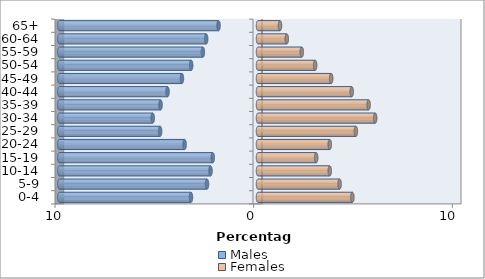
| Category | Males | Females |
|---|---|---|
| 0-4 | -3.374 | 4.751 |
| 5-9 | -2.567 | 4.109 |
| 10-14 | -2.391 | 3.612 |
| 15-19 | -2.277 | 2.929 |
| 20-24 | -3.695 | 3.612 |
| 25-29 | -4.927 | 4.927 |
| 30-34 | -5.299 | 5.899 |
| 35-39 | -4.906 | 5.568 |
| 40-44 | -4.554 | 4.72 |
| 45-49 | -3.829 | 3.685 |
| 50-54 | -3.364 | 2.877 |
| 55-59 | -2.774 | 2.205 |
| 60-64 | -2.608 | 1.449 |
| 65+ | -1.987 | 1.107 |